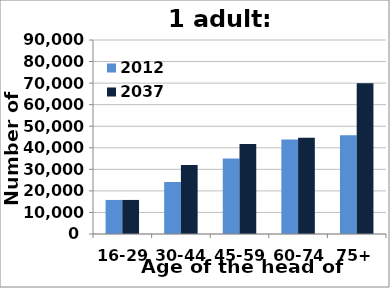
| Category | 2012 | 2037 |
|---|---|---|
| 16-29 | 15803 | 15802 |
| 30-44 | 24173 | 32012 |
| 45-59 | 35065 | 41772 |
| 60-74 | 43866 | 44667 |
| 75+ | 45814 | 69949 |